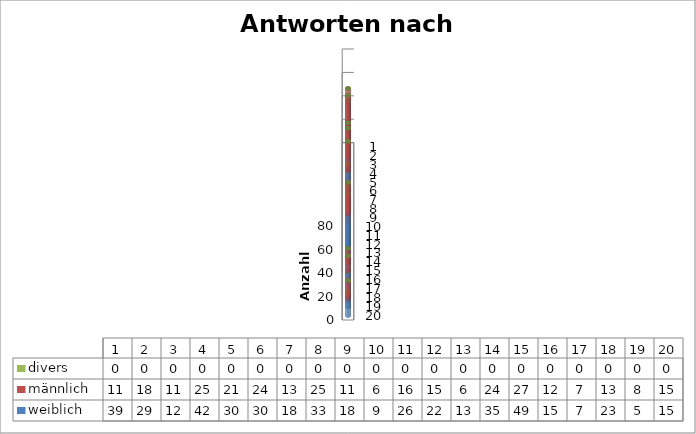
| Category | weiblich    | männlich    | divers    |
|---|---|---|---|
| 1.0 | 39 | 11 | 0 |
| 2.0 | 29 | 18 | 0 |
| 3.0 | 12 | 11 | 0 |
| 4.0 | 42 | 25 | 0 |
| 5.0 | 30 | 21 | 0 |
| 6.0 | 30 | 24 | 0 |
| 7.0 | 18 | 13 | 0 |
| 8.0 | 33 | 25 | 0 |
| 9.0 | 18 | 11 | 0 |
| 10.0 | 9 | 6 | 0 |
| 11.0 | 26 | 16 | 0 |
| 12.0 | 22 | 15 | 0 |
| 13.0 | 13 | 6 | 0 |
| 14.0 | 35 | 24 | 0 |
| 15.0 | 49 | 27 | 0 |
| 16.0 | 15 | 12 | 0 |
| 17.0 | 7 | 7 | 0 |
| 18.0 | 23 | 13 | 0 |
| 19.0 | 5 | 8 | 0 |
| 20.0 | 15 | 15 | 0 |